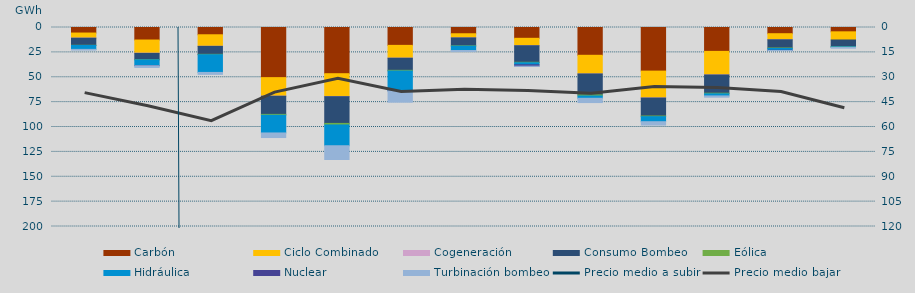
| Category | Carbón | Ciclo Combinado | Cogeneración | Consumo Bombeo | Eólica | Hidráulica | Nuclear | Turbinación bombeo |
|---|---|---|---|---|---|---|---|---|
| 0 | 5563.5 | 5060.2 | 113 | 7129.2 | 169.4 | 3964.2 | 0 | 709 |
| 1 | 12581.1 | 13203.9 | 233 | 6261.8 | 220.5 | 5846.4 | 125 | 1688.7 |
| 2 | 7306.9 | 11559.1 | 88 | 7999 | 402.8 | 17797.7 | 0 | 1941.3 |
| 3 | 50376 | 18600.8 | 92.8 | 18257.2 | 867.9 | 17793.5 | 0 | 4596.7 |
| 4 | 46429 | 22875.8 | 230 | 26858.5 | 1566 | 20878.9 | 0 | 13810.2 |
| 5 | 17956.2 | 12815.5 | 103.4 | 12162.2 | 688.3 | 19850.2 | 66 | 11430.1 |
| 6 | 6283.8 | 4145.3 | 18.9 | 7977.8 | 313 | 4389.8 | 0 | 935.6 |
| 7 | 10864.5 | 7378.2 | 88.1 | 16621.4 | 464.4 | 2067.3 | 1381.8 | 160.4 |
| 8 | 27924.7 | 18737.8 | 26.5 | 21039.7 | 1083.3 | 2318.1 | 0 | 4314 |
| 9 | 43819.1 | 26947.4 | 131.4 | 18038.2 | 700.3 | 5037 | 0 | 3400 |
| 10 | 23995.8 | 23603.4 | 120.4 | 18312.9 | 630.7 | 2095.3 | 0 | 1288.4 |
| 11 | 6238.1 | 6107.2 | 11.4 | 8233.1 | 466.1 | 1774.5 | 300.5 | 185 |
| 12 | 4345.4 | 8205.3 | 0 | 6736.7 | 204.5 | 506 | 0 | 802.1 |